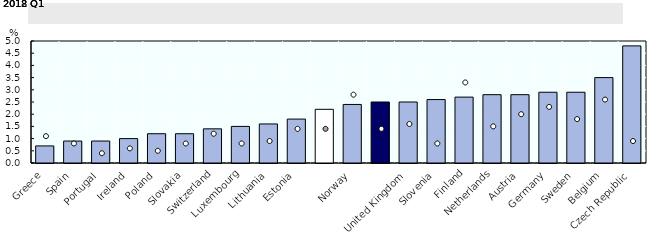
| Category | 2018 Q1 |
|---|---|
| Greece | 0.7 |
| Spain | 0.9 |
| Portugal | 0.9 |
| Ireland | 1 |
| Poland | 1.2 |
| Slovakia | 1.2 |
| Switzerland | 1.4 |
| Luxembourg | 1.5 |
| Lithuania | 1.6 |
| Estonia | 1.8 |
|  | 2.2 |
| Norway | 2.4 |
|  | 2.5 |
| United Kingdom | 2.5 |
| Slovenia | 2.6 |
| Finland | 2.7 |
| Netherlands | 2.8 |
| Austria | 2.8 |
| Germany | 2.9 |
| Sweden | 2.9 |
| Belgium | 3.5 |
| Czech Republic | 4.8 |